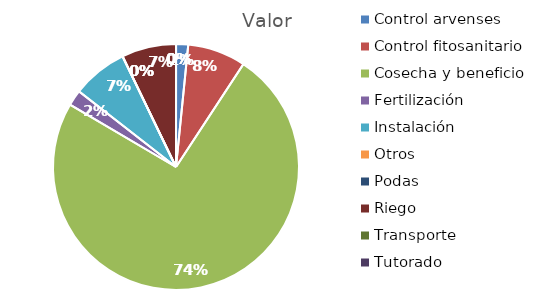
| Category | Valor |
|---|---|
| Control arvenses | 500000 |
| Control fitosanitario | 2400000 |
| Cosecha y beneficio | 23315040 |
| Fertilización | 650000 |
| Instalación | 2293464 |
| Otros | 0 |
| Podas | 0 |
| Riego | 2250000 |
| Transporte | 0 |
| Tutorado | 0 |